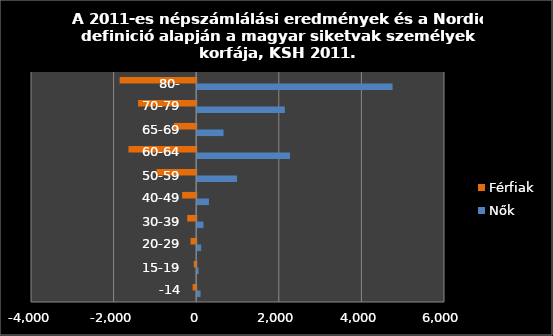
| Category | Nők | Férfiak |
|---|---|---|
| -14 | 81 | -86 |
| 15-19 | 32 | -59 |
| 20-29 | 96 | -137 |
| 30-39 | 152 | -217 |
| 40-49 | 284 | -341 |
| 50-59 | 964 | -960 |
| 60-64 | 2247 | -1640 |
| 65-69 | 638 | -541 |
| 70-79 | 2122 | -1407 |
| 80- | 4731 | -1854 |